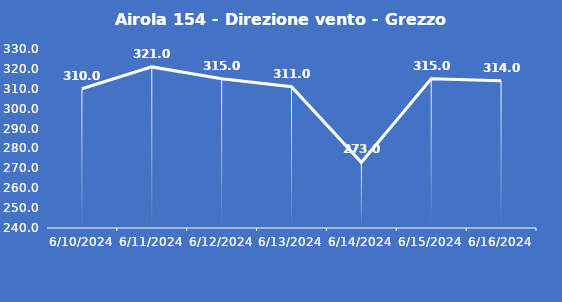
| Category | Airola 154 - Direzione vento - Grezzo (°N) |
|---|---|
| 6/10/24 | 310 |
| 6/11/24 | 321 |
| 6/12/24 | 315 |
| 6/13/24 | 311 |
| 6/14/24 | 273 |
| 6/15/24 | 315 |
| 6/16/24 | 314 |